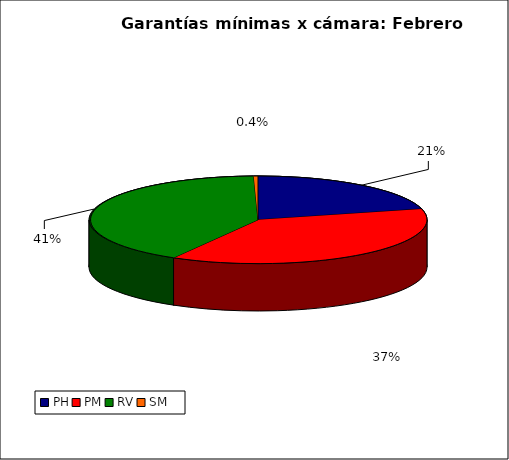
| Category | Series 0 |
|---|---|
| PH | 2410.138 |
| PM | 4281.549 |
| RV | 4734.139 |
| SM | 46.74 |